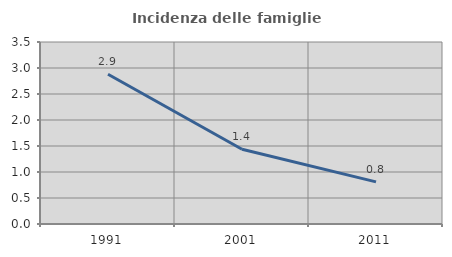
| Category | Incidenza delle famiglie numerose |
|---|---|
| 1991.0 | 2.879 |
| 2001.0 | 1.438 |
| 2011.0 | 0.811 |